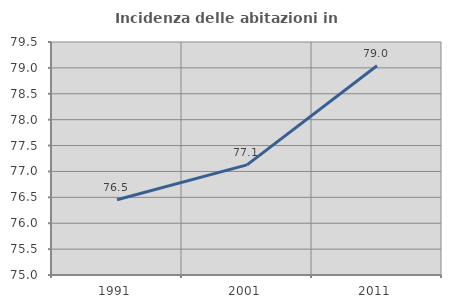
| Category | Incidenza delle abitazioni in proprietà  |
|---|---|
| 1991.0 | 76.453 |
| 2001.0 | 77.128 |
| 2011.0 | 79.042 |